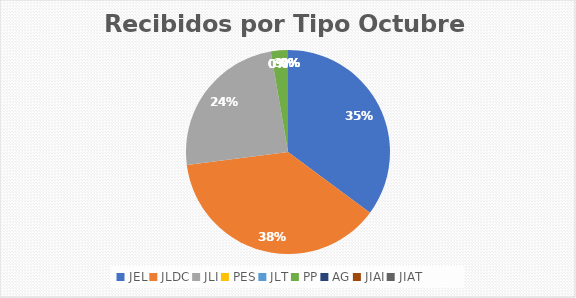
| Category | Series 0 |
|---|---|
| JEL | 13 |
| JLDC | 14 |
| JLI | 9 |
| PES | 0 |
| JLT | 0 |
| PP | 1 |
| AG | 0 |
| JIAI | 0 |
| JIAT | 0 |